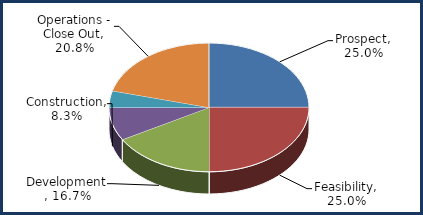
| Category | Series 0 |
|---|---|
| Prospect | 0.25 |
| Feasibility | 0.25 |
| Development | 0.167 |
| Construction | 0.083 |
| Operations - Lease Up | 0.042 |
| Operations - Close Out | 0.208 |